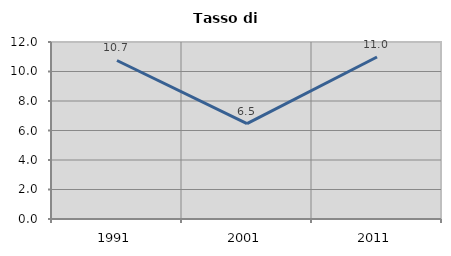
| Category | Tasso di disoccupazione   |
|---|---|
| 1991.0 | 10.746 |
| 2001.0 | 6.461 |
| 2011.0 | 10.984 |